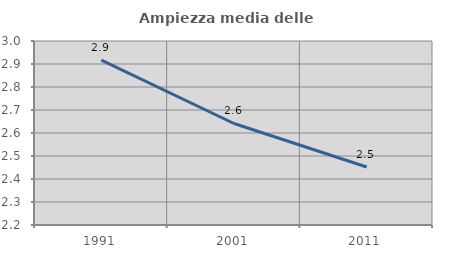
| Category | Ampiezza media delle famiglie |
|---|---|
| 1991.0 | 2.917 |
| 2001.0 | 2.641 |
| 2011.0 | 2.452 |